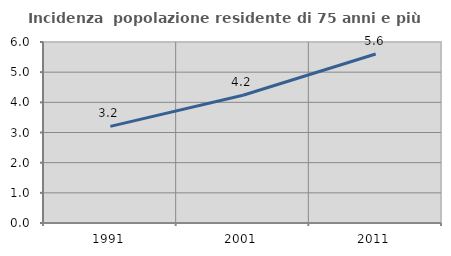
| Category | Incidenza  popolazione residente di 75 anni e più |
|---|---|
| 1991.0 | 3.204 |
| 2001.0 | 4.236 |
| 2011.0 | 5.603 |